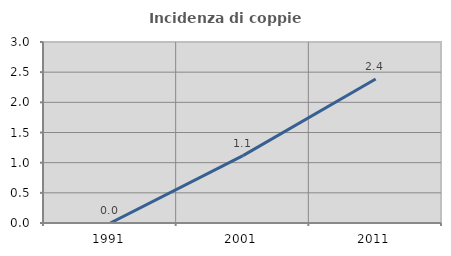
| Category | Incidenza di coppie miste |
|---|---|
| 1991.0 | 0 |
| 2001.0 | 1.117 |
| 2011.0 | 2.386 |